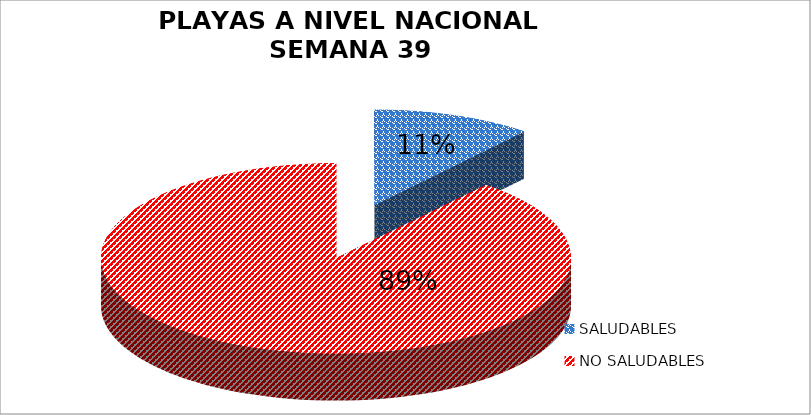
| Category | N.° |
|---|---|
| SALUDABLES | 15 |
| NO SALUDABLES | 122 |